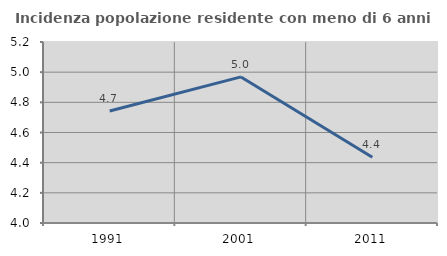
| Category | Incidenza popolazione residente con meno di 6 anni |
|---|---|
| 1991.0 | 4.742 |
| 2001.0 | 4.968 |
| 2011.0 | 4.436 |